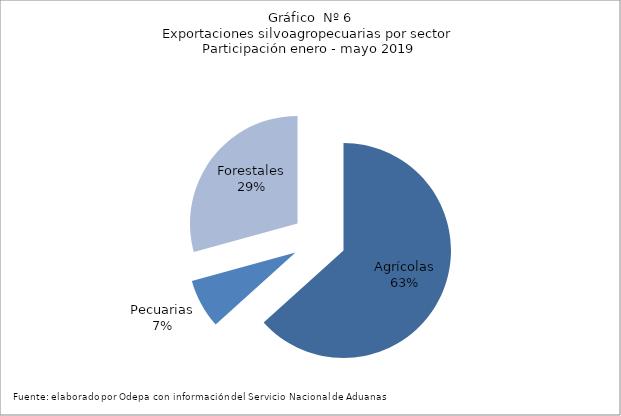
| Category | Series 0 |
|---|---|
| Agrícolas | 5044991 |
| Pecuarias | 589585 |
| Forestales | 2332596 |